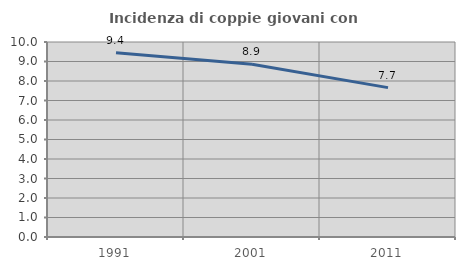
| Category | Incidenza di coppie giovani con figli |
|---|---|
| 1991.0 | 9.444 |
| 2001.0 | 8.854 |
| 2011.0 | 7.661 |